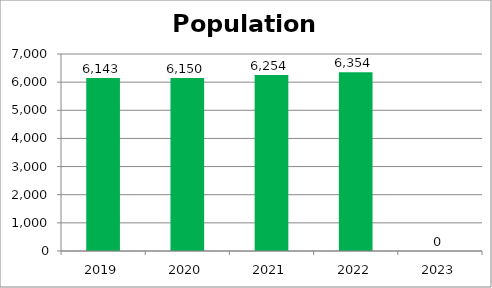
| Category | Population Served |
|---|---|
| 2019.0 | 6143 |
| 2020.0 | 6150 |
| 2021.0 | 6254 |
| 2022.0 | 6354 |
| 2023.0 | 0 |